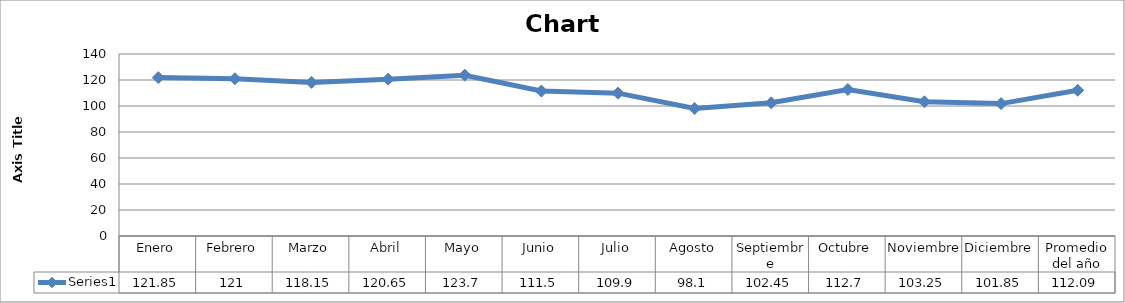
| Category | Series 0 |
|---|---|
| Enero | 121.85 |
| Febrero | 121 |
| Marzo | 118.15 |
| Abril | 120.65 |
| Mayo | 123.7 |
| Junio | 111.5 |
| Julio | 109.9 |
| Agosto | 98.1 |
| Septiembre | 102.45 |
| Octubre | 112.7 |
| Noviembre | 103.25 |
| Diciembre | 101.85 |
| Promedio del año | 112.092 |